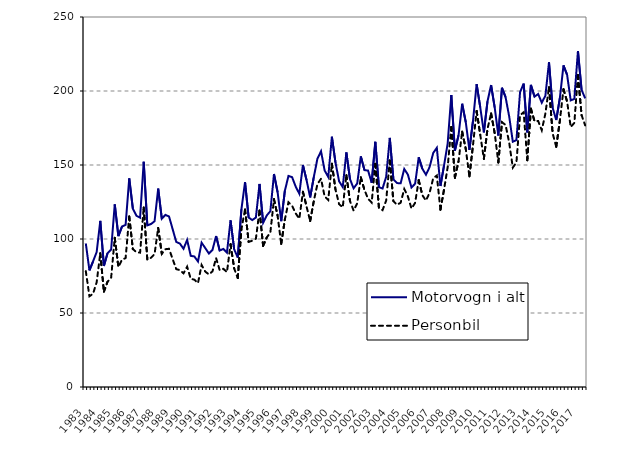
| Category | Motorvogn i alt | Personbil |
|---|---|---|
| 1983.0 | 97 | 78.3 |
| nan | 78.8 | 61.3 |
| nan | 84.8 | 63 |
| nan | 91.2 | 70.8 |
| 1984.0 | 112.2 | 90.4 |
| nan | 81.8 | 64.4 |
| nan | 90.4 | 71.1 |
| nan | 92.9 | 73.9 |
| 1985.0 | 123.4 | 100.8 |
| nan | 102 | 81.1 |
| nan | 108.4 | 86 |
| nan | 109.6 | 87.1 |
| 1986.0 | 141 | 115.2 |
| nan | 120.5 | 93.2 |
| nan | 115.7 | 91.1 |
| nan | 114.4 | 90.8 |
| 1987.0 | 152.2 | 121.3 |
| nan | 109.2 | 86.1 |
| nan | 110.1 | 87.3 |
| nan | 112 | 89.8 |
| 1988.0 | 134.1 | 107.5 |
| nan | 113.7 | 90 |
| nan | 116.3 | 93.1 |
| nan | 115.2 | 93.4 |
| 1989.0 | 106.6 | 86.4 |
| nan | 98 | 79.6 |
| nan | 96.9 | 79 |
| nan | 93.4 | 76.8 |
| 1990.0 | 99.4 | 81.3 |
| nan | 88.6 | 73.1 |
| nan | 88.2 | 72.5 |
| nan | 84.8 | 70.2 |
| 1991.0 | 97.5 | 82.4 |
| nan | 93.9 | 78 |
| nan | 90.2 | 76.1 |
| nan | 92.6 | 78.1 |
| 1992.0 | 102 | 87.1 |
| nan | 92.2 | 78.9 |
| nan | 93.3 | 79.9 |
| nan | 90.8 | 77.6 |
| 1993.0 | 112.6 | 96.5 |
| nan | 93 | 80.1 |
| nan | 87.5 | 73.6 |
| nan | 120.1 | 106.6 |
| 1994.0 | 138.4 | 120 |
| nan | 114.5 | 98.1 |
| nan | 112.8 | 98.8 |
| nan | 114.5 | 100.2 |
| 1995.0 | 137.2 | 119.3 |
| nan | 111 | 95.4 |
| nan | 115.9 | 101 |
| nan | 118.8 | 104.4 |
| 1996.0 | 143.9 | 126.9 |
| nan | 131.6 | 115.7 |
| nan | 112 | 96.7 |
| nan | 132.5 | 113.1 |
| 1997.0 | 142.6 | 124.8 |
| nan | 141.8 | 122.5 |
| nan | 135.4 | 117.3 |
| nan | 130.6 | 113.7 |
| 1998.0 | 150 | 131.9 |
| nan | 139.8 | 122 |
| nan | 128.1 | 112.1 |
| nan | 141.8 | 125.6 |
| 1999.0 | 154.2 | 137.1 |
| nan | 159.3 | 140.7 |
| nan | 146.3 | 128.7 |
| nan | 141.9 | 126.4 |
| 2000.0 | 169.1 | 150.9 |
| nan | 151.5 | 133.4 |
| nan | 139 | 123.5 |
| nan | 135.1 | 121.4 |
| 2001.0 | 158.5 | 143.1 |
| nan | 140.46 | 125.7 |
| nan | 134.24 | 119.2 |
| nan | 137.495 | 124.072 |
| 2002.0 | 155.814 | 141.724 |
| nan | 146.543 | 133.19 |
| nan | 146.231 | 127.141 |
| nan | 137.967 | 124.641 |
| 2003.0 | 165.679 | 150.811 |
| nan | 135.021 | 121.101 |
| nan | 134.111 | 119.491 |
| nan | 142.013 | 125.959 |
| 2004.0 | 168.309 | 153.043 |
| nan | 140.267 | 125.568 |
| nan | 137.77 | 123.121 |
| nan | 137.685 | 124.506 |
| 2005.0 | 147.311 | 133.756 |
| nan | 143.517 | 128.79 |
| nan | 134.783 | 120.571 |
| nan | 137.37 | 124.382 |
| 2006.0 | 155.213 | 139.728 |
| nan | 147.444 | 129.572 |
| nan | 143.451 | 126.006 |
| nan | 148.561 | 131.195 |
| 2007.0 | 158.1 | 141.084 |
| nan | 161.613 | 142.897 |
| nan | 135.821 | 119.753 |
| nan | 149.791 | 133.498 |
| 2008.0 | 164.642 | 148.614 |
| nan | 197.287 | 175.714 |
| nan | 159.718 | 141.407 |
| nan | 170.057 | 152.54 |
| 2009.0 | 191.38 | 172.559 |
| nan | 178.906 | 160.765 |
| nan | 160.234 | 142.312 |
| nan | 179.857 | 163.532 |
| 2010.0 | 204.636 | 186.507 |
| nan | 188.957 | 170.463 |
| nan | 172.077 | 154.156 |
| nan | 192.961 | 174.399 |
| 2011.0 | 204.005 | 184.86 |
| nan | 188.741 | 171.333 |
| nan | 169.934 | 151.694 |
| nan | 202.176 | 178.919 |
| 2012.0 | 195.829 | 177.072 |
| nan | 182.751 | 165.128 |
| nan | 165.73 | 148.242 |
| nan | 166.805 | 151.728 |
| 2013.0 | 199.181 | 183.653 |
| nan | 205.015 | 185.634 |
| nan | 172.044 | 153.21 |
| nan | 204.1 | 188.079 |
| 2014.0 | 196.177 | 179.552 |
| nan | 197.965 | 179.767 |
| nan | 192.105 | 173.474 |
| nan | 196.809 | 184.739 |
| 2015.0 | 219.419 | 202.592 |
| nan | 188.696 | 171.451 |
| nan | 180.388 | 162.297 |
| nan | 195.23 | 179.891 |
| 2016.0 | 217.298 | 201.197 |
| nan | 210.949 | 192.893 |
| nan | 193.648 | 175.642 |
| nan | 194.663 | 178.455 |
| 2017.0 | 227.029 | 210.738 |
| nan | 200.767 | 183.708 |
| nan | 195.059 | 176.766 |